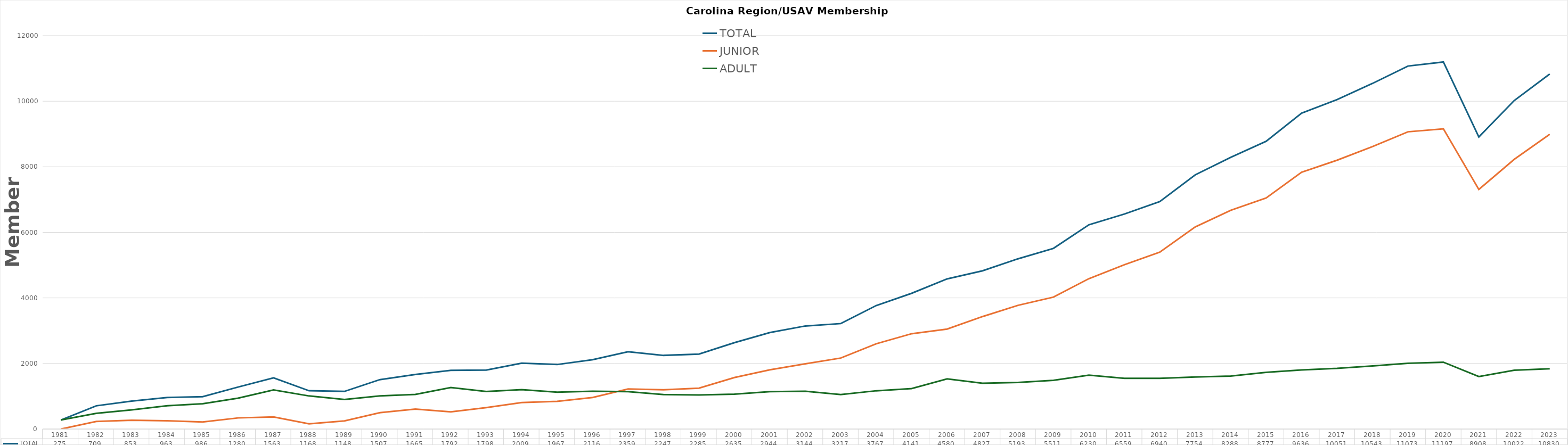
| Category | TOTAL | JUNIOR | ADULT |
|---|---|---|---|
| 1981.0 | 275 | 0 | 275 |
| 1982.0 | 709 | 230 | 479 |
| 1983.0 | 853 | 269 | 584 |
| 1984.0 | 963 | 251 | 712 |
| 1985.0 | 986 | 216 | 770 |
| 1986.0 | 1280 | 339 | 941 |
| 1987.0 | 1563 | 369 | 1194 |
| 1988.0 | 1168 | 159 | 1009 |
| 1989.0 | 1148 | 248 | 900 |
| 1990.0 | 1507 | 498 | 1009 |
| 1991.0 | 1665 | 608 | 1057 |
| 1992.0 | 1792 | 524 | 1268 |
| 1993.0 | 1798 | 652 | 1146 |
| 1994.0 | 2009 | 806 | 1203 |
| 1995.0 | 1967 | 844 | 1123 |
| 1996.0 | 2116 | 963 | 1153 |
| 1997.0 | 2359 | 1220 | 1139 |
| 1998.0 | 2247 | 1196 | 1051 |
| 1999.0 | 2285 | 1246 | 1039 |
| 2000.0 | 2635 | 1572 | 1063 |
| 2001.0 | 2944 | 1805 | 1139 |
| 2002.0 | 3144 | 1990 | 1154 |
| 2003.0 | 3217 | 2166 | 1051 |
| 2004.0 | 3767 | 2600 | 1167 |
| 2005.0 | 4141 | 2908 | 1233 |
| 2006.0 | 4580 | 3049 | 1531 |
| 2007.0 | 4827 | 3431 | 1396 |
| 2008.0 | 5193 | 3774 | 1419 |
| 2009.0 | 5511 | 4024 | 1487 |
| 2010.0 | 6230 | 4587 | 1643 |
| 2011.0 | 6559 | 5011 | 1548 |
| 2012.0 | 6940 | 5395 | 1545 |
| 2013.0 | 7754 | 6166 | 1588 |
| 2014.0 | 8288 | 6673 | 1615 |
| 2015.0 | 8777 | 7047 | 1730 |
| 2016.0 | 9636 | 7835 | 1801 |
| 2017.0 | 10051 | 8200 | 1851 |
| 2018.0 | 10543 | 8617 | 1926 |
| 2019.0 | 11073 | 9067 | 2006 |
| 2020.0 | 11197 | 9158 | 2039 |
| 2021.0 | 8908 | 7307 | 1601 |
| 2022.0 | 10022 | 8228 | 1794 |
| 2023.0 | 10830 | 8991 | 1839 |